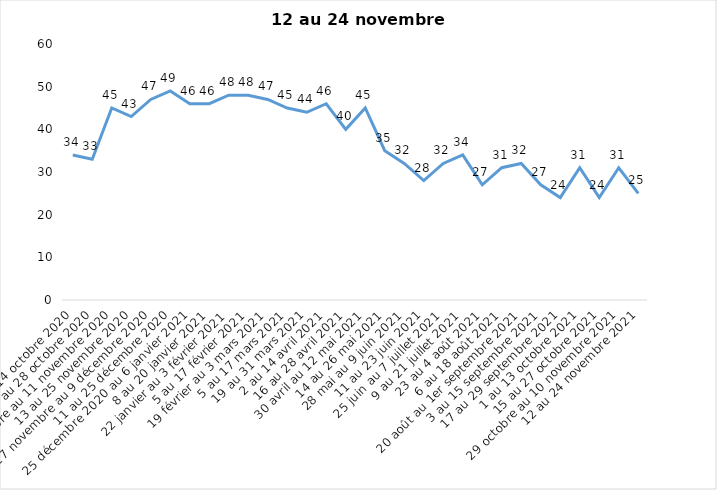
| Category | Toujours aux trois mesures |
|---|---|
| 2 au 14 octobre 2020 | 34 |
| 16 au 28 octobre 2020 | 33 |
| 30 octobre au 11 novembre 2020 | 45 |
| 13 au 25 novembre 2020 | 43 |
| 27 novembre au 9 décembre 2020 | 47 |
| 11 au 25 décembre 2020 | 49 |
| 25 décembre 2020 au 6 janvier 2021 | 46 |
| 8 au 20 janvier 2021 | 46 |
| 22 janvier au 3 février 2021 | 48 |
| 5 au 17 février 2021 | 48 |
| 19 février au 3 mars 2021 | 47 |
| 5 au 17 mars 2021 | 45 |
| 19 au 31 mars 2021 | 44 |
| 2 au 14 avril 2021 | 46 |
| 16 au 28 avril 2021 | 40 |
| 30 avril au 12 mai 2021 | 45 |
| 14 au 26 mai 2021 | 35 |
| 28 mai au 9 juin 2021 | 32 |
| 11 au 23 juin 2021 | 28 |
| 25 juin au 7 juillet 2021 | 32 |
| 9 au 21 juillet 2021 | 34 |
| 23 au 4 août 2021 | 27 |
| 6 au 18 août 2021 | 31 |
| 20 août au 1er septembre 2021 | 32 |
| 3 au 15 septembre 2021 | 27 |
| 17 au 29 septembre 2021 | 24 |
| 1 au 13 octobre 2021 | 31 |
| 15 au 27 octobre 2021 | 24 |
| 29 octobre au 10 novembre 2021 | 31 |
| 12 au 24 novembre 2021 | 25 |